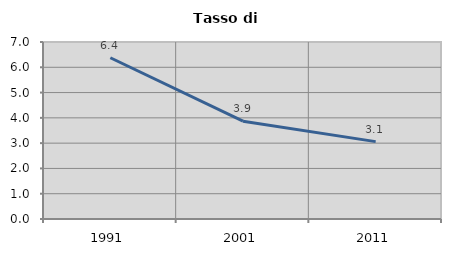
| Category | Tasso di disoccupazione   |
|---|---|
| 1991.0 | 6.378 |
| 2001.0 | 3.868 |
| 2011.0 | 3.06 |